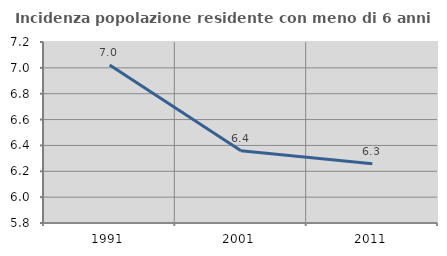
| Category | Incidenza popolazione residente con meno di 6 anni |
|---|---|
| 1991.0 | 7.023 |
| 2001.0 | 6.359 |
| 2011.0 | 6.259 |